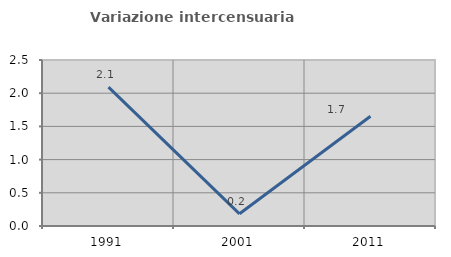
| Category | Variazione intercensuaria annua |
|---|---|
| 1991.0 | 2.092 |
| 2001.0 | 0.184 |
| 2011.0 | 1.653 |